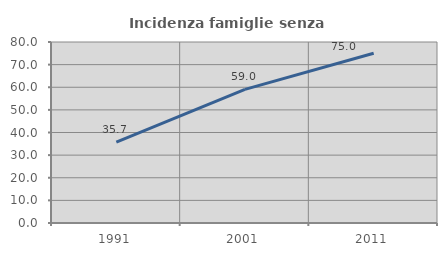
| Category | Incidenza famiglie senza nuclei |
|---|---|
| 1991.0 | 35.714 |
| 2001.0 | 59.048 |
| 2011.0 | 75 |